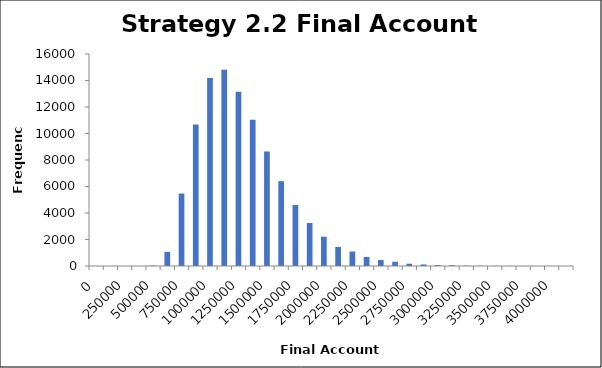
| Category | Frequency |
|---|---|
| 0 | 0 |
| 125000 | 0 |
| 250000 | 0 |
| 375000 | 1 |
| 500000 | 32 |
| 625000 | 1069 |
| 750000 | 5466 |
| 875000 | 10687 |
| 1000000 | 14180 |
| 1125000 | 14810 |
| 1250000 | 13144 |
| 1375000 | 11042 |
| 1500000 | 8643 |
| 1625000 | 6400 |
| 1750000 | 4606 |
| 1875000 | 3243 |
| 2000000 | 2212 |
| 2125000 | 1442 |
| 2250000 | 1090 |
| 2375000 | 685 |
| 2500000 | 447 |
| 2625000 | 322 |
| 2750000 | 170 |
| 2875000 | 116 |
| 3000000 | 65 |
| 3125000 | 58 |
| 3250000 | 26 |
| 3375000 | 15 |
| 3500000 | 13 |
| 3625000 | 8 |
| 3750000 | 6 |
| 3875000 | 2 |
| 4000000 | 1 |
| More | 1 |